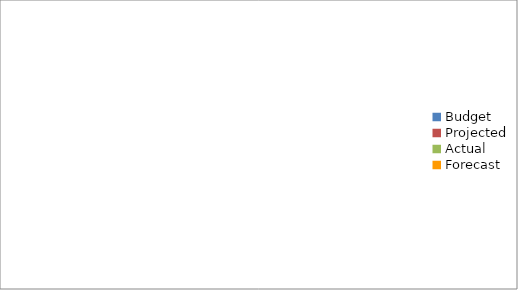
| Category | Series 0 |
|---|---|
| Budget | 780 |
| Projected | 890 |
| Actual | 3320 |
| Forecast | 890 |